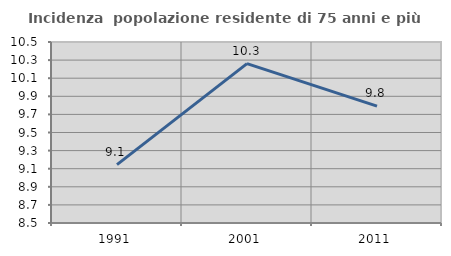
| Category | Incidenza  popolazione residente di 75 anni e più |
|---|---|
| 1991.0 | 9.145 |
| 2001.0 | 10.261 |
| 2011.0 | 9.792 |